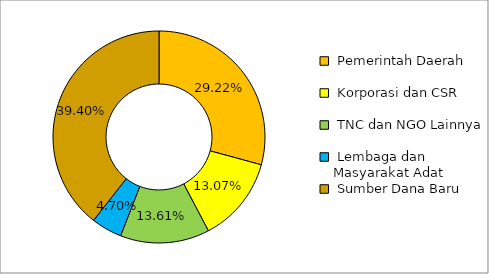
| Category | Series 0 |
|---|---|
| Pemerintah Daerah | 0.292 |
| Korporasi dan CSR | 0.131 |
| TNC dan NGO Lainnya | 0.136 |
| Lembaga dan Masyarakat Adat | 0.047 |
| Sumber Dana Baru | 0.394 |